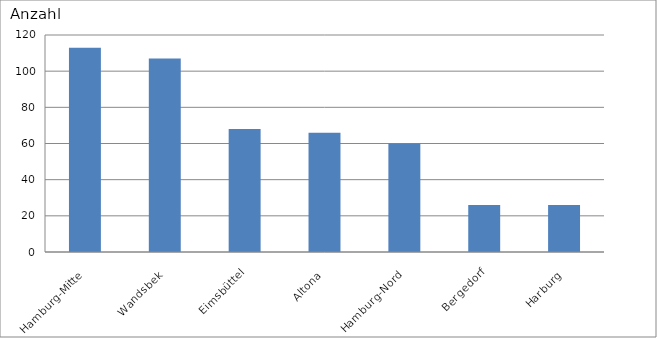
| Category | Hamburg-Mitte Wandsbek Eimsbüttel Altona Hamburg-Nord Bergedorf Harburg |
|---|---|
| Hamburg-Mitte | 113 |
| Wandsbek | 107 |
| Eimsbüttel | 68 |
| Altona | 66 |
| Hamburg-Nord | 60 |
| Bergedorf | 26 |
| Harburg | 26 |